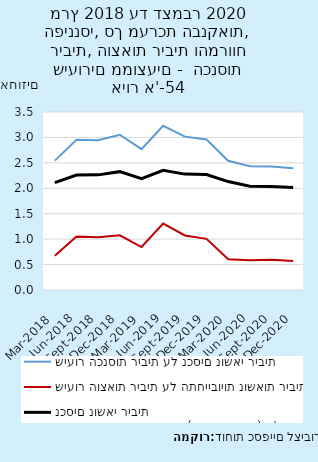
| Category | שיעור הכנסות ריבית על נכסים נושאי ריבית | שיעור הוצאות ריבית על התחייבויות נושאות ריבית | שיעור הכנסות ריבית, נטו (מרווח פיננסי) על נכסים נושאי ריבית |
|---|---|---|---|
| 2018-03-31 | 2.543 | 0.672 | 2.11 |
| 2018-06-30 | 2.954 | 1.053 | 2.262 |
| 2018-09-30 | 2.945 | 1.039 | 2.264 |
| 2018-12-31 | 3.053 | 1.076 | 2.327 |
| 2019-03-31 | 2.771 | 0.845 | 2.19 |
| 2019-06-30 | 3.229 | 1.306 | 2.352 |
| 2019-09-30 | 3.015 | 1.072 | 2.278 |
| 2019-12-31 | 2.959 | 1.006 | 2.269 |
| 2020-03-31 | 2.542 | 0.606 | 2.132 |
| 2020-06-30 | 2.435 | 0.587 | 2.041 |
| 2020-09-30 | 2.43 | 0.593 | 2.034 |
| 2020-12-31 | 2.394 | 0.569 | 2.016 |